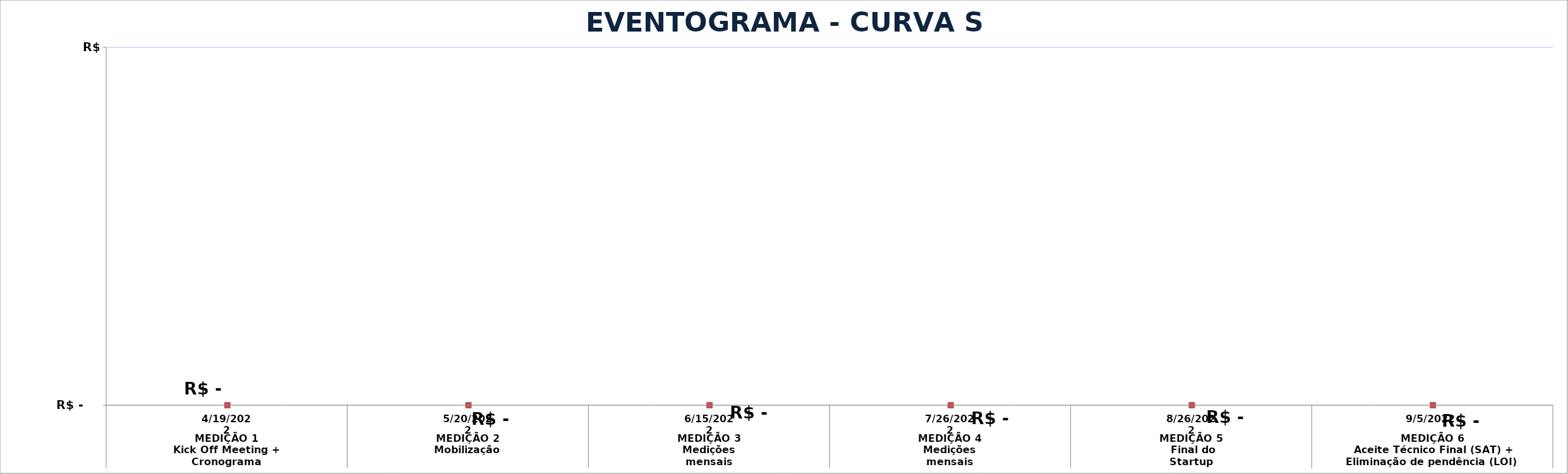
| Category | Series 0 | Series 1 |
|---|---|---|
| 0 | 0 | 0 |
| 1 | 0 | 0 |
| 2 | 0 | 0.1 |
| 3 | 0 | 0 |
| 4 | 0 | 0 |
| 5 | 0 | 0 |